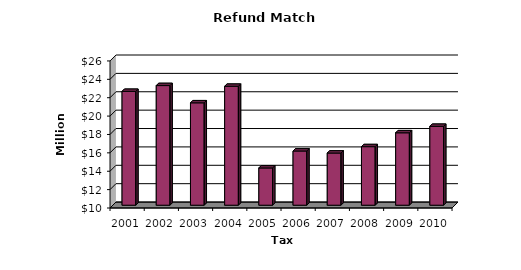
| Category | Total |
|---|---|
| 2001.0 | 22.384 |
| 2002.0 | 23.014 |
| 2003.0 | 21.137 |
| 2004.0 | 22.937 |
| 2005.0 | 14.052 |
| 2006.0 | 15.896 |
| 2007.0 | 15.673 |
| 2008.0 | 16.367 |
| 2009.0 | 17.876 |
| 2010.0 | 18.578 |